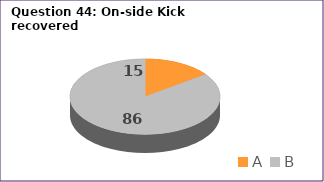
| Category | Series 0 |
|---|---|
| A | 15 |
| B | 86 |